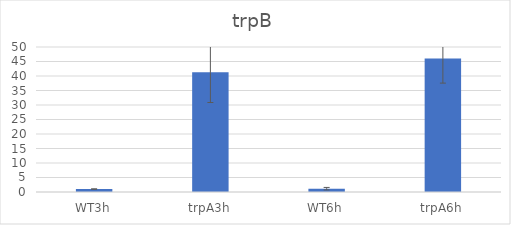
| Category | Series 0 |
|---|---|
| WT3h | 1.015 |
| trpA3h | 41.336 |
| WT6h | 1.144 |
| trpA6h | 46.068 |